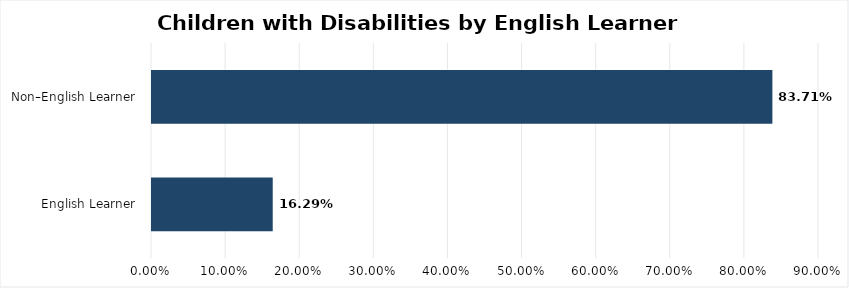
| Category | Series 0 |
|---|---|
| English Learner  | 0.163 |
| Non–English Learner  | 0.837 |